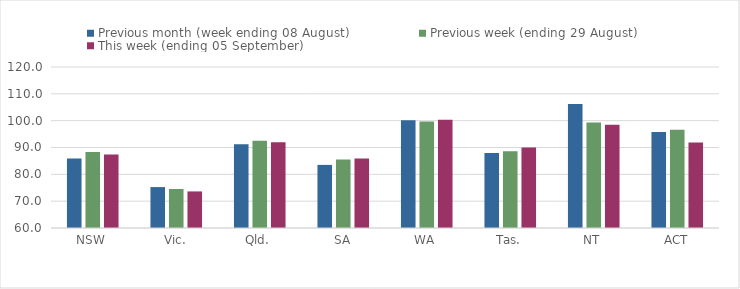
| Category | Previous month (week ending 08 August) | Previous week (ending 29 August) | This week (ending 05 September) |
|---|---|---|---|
| NSW | 85.94 | 88.32 | 87.38 |
| Vic. | 75.25 | 74.53 | 73.63 |
| Qld. | 91.18 | 92.48 | 91.93 |
| SA | 83.52 | 85.55 | 85.93 |
| WA | 100.11 | 99.69 | 100.35 |
| Tas. | 87.96 | 88.64 | 90.01 |
| NT | 106.25 | 99.34 | 98.52 |
| ACT | 95.78 | 96.61 | 91.9 |